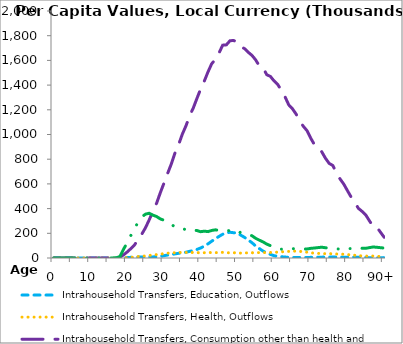
| Category | Intrahousehold Transfers, Education, Outflows | Intrahousehold Transfers, Health, Outflows | Intrahousehold Transfers, Consumption other than health and education, Outflows | Intrahousehold Transfers, Saving, Outflows |
|---|---|---|---|---|
| 0 | 0 | 0 | 0 | 0 |
|  | 0 | 0 | 0 | 0 |
| 2 | 0 | 0 | 0 | 0 |
| 3 | 0 | 0 | 0 | 0 |
| 4 | 0 | 0 | 0 | 0 |
| 5 | 0 | 0 | 0 | 0 |
| 6 | 0 | 0 | 0 | 0 |
| 7 | 0 | 0 | 0 | 0 |
| 8 | 0 | 0 | 0 | 0 |
| 9 | 0 | 0 | 0 | 0 |
| 10 | 0 | 0 | 0 | 0 |
| 11 | 0 | 0 | 0 | 0 |
| 12 | 0 | 0 | 0 | 0 |
| 13 | 0 | 0 | 0 | 0 |
| 14 | 0 | 0 | 0 | 0 |
| 15 | 0 | 0 | 1.26 | 9.11 |
| 16 | 0 | 3.162 | 85.513 | 91.482 |
| 17 | 5.984 | 9.025 | 108.234 | 1267.171 |
| 18 | 495.819 | 245.836 | 7178.938 | 12240.079 |
| 19 | 2573.935 | 913.714 | 25123.078 | 71339.321 |
| 20 | 3879.474 | 3083.724 | 48975.677 | 124489.202 |
| 21 | 5285.856 | 5141.272 | 76531.538 | 183606.486 |
| 22 | 6791.191 | 7902.272 | 106769.087 | 240390.004 |
| 23 | 7522.714 | 11683.051 | 148513.149 | 291618.811 |
| 24 | 7631.013 | 14356.991 | 194804.032 | 333726.769 |
| 25 | 7805.067 | 16832.329 | 246523.079 | 355439.14 |
| 26 | 7883.42 | 20593.551 | 309988.052 | 362252.406 |
| 27 | 8838.36 | 24188.53 | 378625.598 | 346872.357 |
| 28 | 10320.268 | 27279.596 | 443611.099 | 335860.988 |
| 29 | 13886.212 | 31315.567 | 527600.633 | 316519.793 |
| 30 | 18673.483 | 35411.72 | 605892.284 | 305762.393 |
| 31 | 24115.571 | 39104.032 | 684292.048 | 284794.968 |
| 32 | 27663.515 | 41352 | 760967.579 | 272248.791 |
| 33 | 33337.489 | 42586.425 | 850377.901 | 251737.524 |
| 34 | 37912.548 | 44901.966 | 918130.913 | 245820.088 |
| 35 | 42408.527 | 44944.744 | 1002074.94 | 235658.242 |
| 36 | 46534.013 | 44798.072 | 1070244.702 | 231169.918 |
| 37 | 54020.953 | 44386.837 | 1151591.323 | 236430.138 |
| 38 | 60274.093 | 44609.013 | 1215298.709 | 227107.376 |
| 39 | 69583.643 | 42896.872 | 1293063.948 | 222149.91 |
| 40 | 81268.462 | 43799.18 | 1367944.024 | 212891.737 |
| 41 | 96601.76 | 42902.633 | 1432714.42 | 217368.062 |
| 42 | 114334.717 | 44267.937 | 1506632.723 | 213569.098 |
| 43 | 135630.719 | 44240.23 | 1572223.676 | 222923.73 |
| 44 | 156093.484 | 43139.102 | 1608565.692 | 228134.559 |
| 45 | 174710.02 | 44524.895 | 1659165.031 | 223480.001 |
| 46 | 192264.563 | 45649.609 | 1723336.167 | 225314.622 |
| 47 | 203503.444 | 42455.766 | 1725846.014 | 225180.6 |
| 48 | 208426.722 | 42317.891 | 1759465.43 | 219524.243 |
| 49 | 204728.242 | 42760.083 | 1761016.329 | 212343.962 |
| 50 | 202004.793 | 41002.342 | 1746976.985 | 219198.257 |
| 51 | 183671.473 | 39479.339 | 1710738.803 | 203556.909 |
| 52 | 166049.285 | 41228.665 | 1694390.972 | 200150.812 |
| 53 | 144602.536 | 41622.847 | 1665116.003 | 190821.087 |
| 54 | 123681.917 | 42369.407 | 1639877.168 | 179822.767 |
| 55 | 96387.221 | 43195.229 | 1603926.268 | 159146.729 |
| 56 | 76264.87 | 43497.812 | 1554128.984 | 144188.619 |
| 57 | 56027.612 | 44709.846 | 1541828.035 | 130508.349 |
| 58 | 40635.309 | 43188.827 | 1484702.926 | 112679.324 |
| 59 | 29157.391 | 44796.321 | 1470191.773 | 100015.418 |
| 60 | 18576.483 | 45585.869 | 1433793.007 | 89134.69 |
| 61 | 14124.768 | 47351.124 | 1405656.667 | 83680.911 |
| 62 | 10233.786 | 49360.026 | 1356178.767 | 71771.91 |
| 63 | 7621.321 | 52756.277 | 1304677.507 | 70409.875 |
| 64 | 5338.269 | 53246.397 | 1240208.029 | 70799.793 |
| 65 | 4384.757 | 55396.659 | 1208500.035 | 76040.555 |
| 66 | 4237.109 | 55012.998 | 1165738.034 | 73760.781 |
| 67 | 4338.264 | 53555.374 | 1108228.947 | 73849.553 |
| 68 | 3992.631 | 50470.359 | 1065855.411 | 72728.189 |
| 69 | 4120.17 | 46953.082 | 1030215.378 | 73311.948 |
| 70 | 5167.891 | 41762.372 | 969679.876 | 78215.515 |
| 71 | 5288.985 | 39596.028 | 918150.386 | 80700.831 |
| 72 | 6132.53 | 37214.627 | 891288.592 | 84337.8 |
| 73 | 6852.898 | 35685.264 | 859942.747 | 87452.069 |
| 74 | 7950.007 | 34936.523 | 807877.844 | 82855.748 |
| 75 | 7186.02 | 34825.39 | 766483.525 | 79357.224 |
| 76 | 8156.289 | 34933.455 | 749135.144 | 78826.151 |
| 77 | 7262.418 | 32166.352 | 688489.796 | 74284.082 |
| 78 | 7712.251 | 31770.343 | 639367.111 | 71920.748 |
| 79 | 6324.265 | 30665.597 | 597942.26 | 79012.386 |
| 80 | 6173.067 | 27807.378 | 545051.683 | 77170.526 |
| 81 | 7024.659 | 24083.472 | 493506.769 | 75734.712 |
| 82 | 6751.607 | 22041.205 | 449258.079 | 74899.343 |
| 83 | 5857.55 | 18838.487 | 401286.739 | 80681.425 |
| 84 | 5550.146 | 16428.583 | 377102.349 | 78847.645 |
| 85 | 4963.523 | 15697.636 | 347792.147 | 78600.679 |
| 86 | 2002.956 | 14681.301 | 300411.578 | 84013.694 |
| 87 | 1766.467 | 15703.159 | 255039.906 | 89229.06 |
| 88 | 2031.508 | 13791.658 | 249712.189 | 86769.882 |
| 89 | 2579.81 | 12258.288 | 208821.678 | 83585.064 |
| 90+ | 3128.112 | 10724.918 | 167931.166 | 80400.247 |